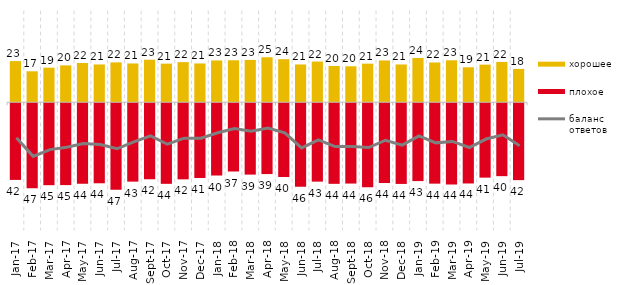
| Category | хорошее | плохое |
|---|---|---|
| 2017-01-01 | 22.55 | -42 |
| 2017-02-01 | 16.95 | -46.6 |
| 2017-03-01 | 18.95 | -44.9 |
| 2017-04-01 | 20.2 | -44.85 |
| 2017-05-01 | 21.5 | -44.1 |
| 2017-06-01 | 20.7 | -43.85 |
| 2017-07-01 | 21.85 | -47.35 |
| 2017-08-01 | 21.25 | -42.95 |
| 2017-09-01 | 23.3 | -41.7 |
| 2017-10-01 | 21.15 | -44.15 |
| 2017-11-01 | 22 | -41.7 |
| 2017-12-01 | 21.25 | -40.95 |
| 2018-01-01 | 22.9 | -39.6 |
| 2018-02-01 | 23 | -37.45 |
| 2018-03-01 | 23.2 | -39.1 |
| 2018-04-01 | 24.65 | -38.8 |
| 2018-05-01 | 23.6 | -40.4 |
| 2018-06-01 | 20.7 | -45.75 |
| 2018-07-01 | 22.3 | -42.95 |
| 2018-08-01 | 19.85 | -44.15 |
| 2018-09-01 | 19.7 | -44 |
| 2018-10-01 | 21.15 | -46 |
| 2018-11-01 | 22.904 | -43.713 |
| 2018-12-01 | 20.7 | -44.2 |
| 2019-01-01 | 24.25 | -42.65 |
| 2019-02-01 | 21.8 | -44.05 |
| 2019-03-01 | 22.974 | -44.455 |
| 2019-04-01 | 19.158 | -43.96 |
| 2019-05-01 | 20.604 | -40.763 |
| 2019-06-01 | 22.095 | -39.95 |
| 2019-07-01 | 18.267 | -42.129 |